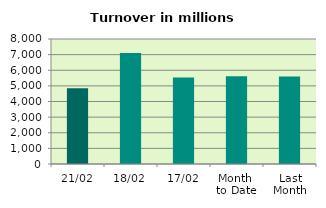
| Category | Series 0 |
|---|---|
| 21/02 | 4840.603 |
| 18/02 | 7111.07 |
| 17/02 | 5532.781 |
| Month 
to Date | 5615.723 |
| Last
Month | 5596.977 |